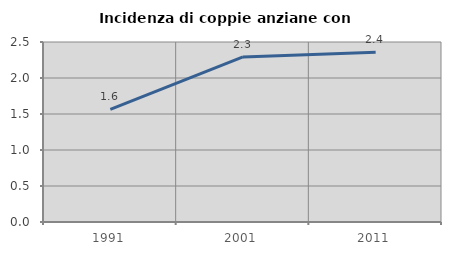
| Category | Incidenza di coppie anziane con figli |
|---|---|
| 1991.0 | 1.565 |
| 2001.0 | 2.292 |
| 2011.0 | 2.356 |